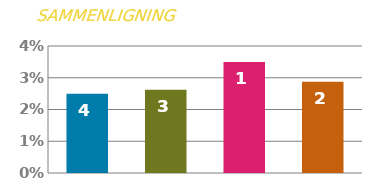
| Category | SATS |
|---|---|
| 0 | 0.025 |
| 1 | 0.026 |
| 2 | 0.035 |
| 3 | 0.029 |